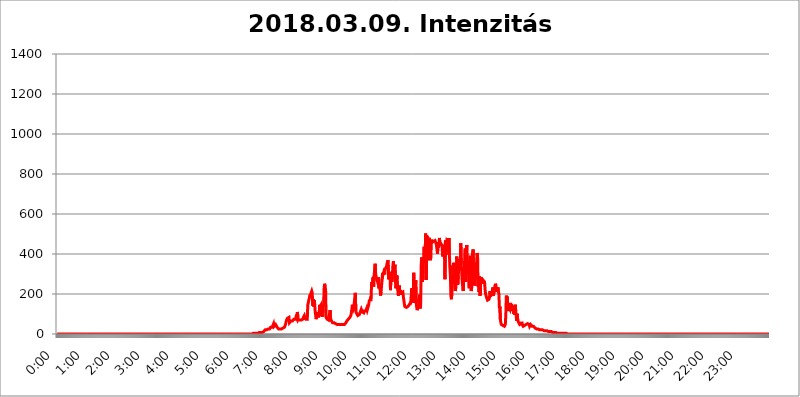
| Category | 2018.03.09. Intenzitás [W/m^2] |
|---|---|
| 0.0 | 0 |
| 0.0006944444444444445 | 0 |
| 0.001388888888888889 | 0 |
| 0.0020833333333333333 | 0 |
| 0.002777777777777778 | 0 |
| 0.003472222222222222 | 0 |
| 0.004166666666666667 | 0 |
| 0.004861111111111111 | 0 |
| 0.005555555555555556 | 0 |
| 0.0062499999999999995 | 0 |
| 0.006944444444444444 | 0 |
| 0.007638888888888889 | 0 |
| 0.008333333333333333 | 0 |
| 0.009027777777777779 | 0 |
| 0.009722222222222222 | 0 |
| 0.010416666666666666 | 0 |
| 0.011111111111111112 | 0 |
| 0.011805555555555555 | 0 |
| 0.012499999999999999 | 0 |
| 0.013194444444444444 | 0 |
| 0.013888888888888888 | 0 |
| 0.014583333333333332 | 0 |
| 0.015277777777777777 | 0 |
| 0.015972222222222224 | 0 |
| 0.016666666666666666 | 0 |
| 0.017361111111111112 | 0 |
| 0.018055555555555557 | 0 |
| 0.01875 | 0 |
| 0.019444444444444445 | 0 |
| 0.02013888888888889 | 0 |
| 0.020833333333333332 | 0 |
| 0.02152777777777778 | 0 |
| 0.022222222222222223 | 0 |
| 0.02291666666666667 | 0 |
| 0.02361111111111111 | 0 |
| 0.024305555555555556 | 0 |
| 0.024999999999999998 | 0 |
| 0.025694444444444447 | 0 |
| 0.02638888888888889 | 0 |
| 0.027083333333333334 | 0 |
| 0.027777777777777776 | 0 |
| 0.02847222222222222 | 0 |
| 0.029166666666666664 | 0 |
| 0.029861111111111113 | 0 |
| 0.030555555555555555 | 0 |
| 0.03125 | 0 |
| 0.03194444444444445 | 0 |
| 0.03263888888888889 | 0 |
| 0.03333333333333333 | 0 |
| 0.034027777777777775 | 0 |
| 0.034722222222222224 | 0 |
| 0.035416666666666666 | 0 |
| 0.036111111111111115 | 0 |
| 0.03680555555555556 | 0 |
| 0.0375 | 0 |
| 0.03819444444444444 | 0 |
| 0.03888888888888889 | 0 |
| 0.03958333333333333 | 0 |
| 0.04027777777777778 | 0 |
| 0.04097222222222222 | 0 |
| 0.041666666666666664 | 0 |
| 0.042361111111111106 | 0 |
| 0.04305555555555556 | 0 |
| 0.043750000000000004 | 0 |
| 0.044444444444444446 | 0 |
| 0.04513888888888889 | 0 |
| 0.04583333333333334 | 0 |
| 0.04652777777777778 | 0 |
| 0.04722222222222222 | 0 |
| 0.04791666666666666 | 0 |
| 0.04861111111111111 | 0 |
| 0.049305555555555554 | 0 |
| 0.049999999999999996 | 0 |
| 0.05069444444444445 | 0 |
| 0.051388888888888894 | 0 |
| 0.052083333333333336 | 0 |
| 0.05277777777777778 | 0 |
| 0.05347222222222222 | 0 |
| 0.05416666666666667 | 0 |
| 0.05486111111111111 | 0 |
| 0.05555555555555555 | 0 |
| 0.05625 | 0 |
| 0.05694444444444444 | 0 |
| 0.057638888888888885 | 0 |
| 0.05833333333333333 | 0 |
| 0.05902777777777778 | 0 |
| 0.059722222222222225 | 0 |
| 0.06041666666666667 | 0 |
| 0.061111111111111116 | 0 |
| 0.06180555555555556 | 0 |
| 0.0625 | 0 |
| 0.06319444444444444 | 0 |
| 0.06388888888888888 | 0 |
| 0.06458333333333334 | 0 |
| 0.06527777777777778 | 0 |
| 0.06597222222222222 | 0 |
| 0.06666666666666667 | 0 |
| 0.06736111111111111 | 0 |
| 0.06805555555555555 | 0 |
| 0.06874999999999999 | 0 |
| 0.06944444444444443 | 0 |
| 0.07013888888888889 | 0 |
| 0.07083333333333333 | 0 |
| 0.07152777777777779 | 0 |
| 0.07222222222222223 | 0 |
| 0.07291666666666667 | 0 |
| 0.07361111111111111 | 0 |
| 0.07430555555555556 | 0 |
| 0.075 | 0 |
| 0.07569444444444444 | 0 |
| 0.0763888888888889 | 0 |
| 0.07708333333333334 | 0 |
| 0.07777777777777778 | 0 |
| 0.07847222222222222 | 0 |
| 0.07916666666666666 | 0 |
| 0.0798611111111111 | 0 |
| 0.08055555555555556 | 0 |
| 0.08125 | 0 |
| 0.08194444444444444 | 0 |
| 0.08263888888888889 | 0 |
| 0.08333333333333333 | 0 |
| 0.08402777777777777 | 0 |
| 0.08472222222222221 | 0 |
| 0.08541666666666665 | 0 |
| 0.08611111111111112 | 0 |
| 0.08680555555555557 | 0 |
| 0.08750000000000001 | 0 |
| 0.08819444444444445 | 0 |
| 0.08888888888888889 | 0 |
| 0.08958333333333333 | 0 |
| 0.09027777777777778 | 0 |
| 0.09097222222222222 | 0 |
| 0.09166666666666667 | 0 |
| 0.09236111111111112 | 0 |
| 0.09305555555555556 | 0 |
| 0.09375 | 0 |
| 0.09444444444444444 | 0 |
| 0.09513888888888888 | 0 |
| 0.09583333333333333 | 0 |
| 0.09652777777777777 | 0 |
| 0.09722222222222222 | 0 |
| 0.09791666666666667 | 0 |
| 0.09861111111111111 | 0 |
| 0.09930555555555555 | 0 |
| 0.09999999999999999 | 0 |
| 0.10069444444444443 | 0 |
| 0.1013888888888889 | 0 |
| 0.10208333333333335 | 0 |
| 0.10277777777777779 | 0 |
| 0.10347222222222223 | 0 |
| 0.10416666666666667 | 0 |
| 0.10486111111111111 | 0 |
| 0.10555555555555556 | 0 |
| 0.10625 | 0 |
| 0.10694444444444444 | 0 |
| 0.1076388888888889 | 0 |
| 0.10833333333333334 | 0 |
| 0.10902777777777778 | 0 |
| 0.10972222222222222 | 0 |
| 0.1111111111111111 | 0 |
| 0.11180555555555556 | 0 |
| 0.11180555555555556 | 0 |
| 0.1125 | 0 |
| 0.11319444444444444 | 0 |
| 0.11388888888888889 | 0 |
| 0.11458333333333333 | 0 |
| 0.11527777777777777 | 0 |
| 0.11597222222222221 | 0 |
| 0.11666666666666665 | 0 |
| 0.1173611111111111 | 0 |
| 0.11805555555555557 | 0 |
| 0.11944444444444445 | 0 |
| 0.12013888888888889 | 0 |
| 0.12083333333333333 | 0 |
| 0.12152777777777778 | 0 |
| 0.12222222222222223 | 0 |
| 0.12291666666666667 | 0 |
| 0.12291666666666667 | 0 |
| 0.12361111111111112 | 0 |
| 0.12430555555555556 | 0 |
| 0.125 | 0 |
| 0.12569444444444444 | 0 |
| 0.12638888888888888 | 0 |
| 0.12708333333333333 | 0 |
| 0.16875 | 0 |
| 0.12847222222222224 | 0 |
| 0.12916666666666668 | 0 |
| 0.12986111111111112 | 0 |
| 0.13055555555555556 | 0 |
| 0.13125 | 0 |
| 0.13194444444444445 | 0 |
| 0.1326388888888889 | 0 |
| 0.13333333333333333 | 0 |
| 0.13402777777777777 | 0 |
| 0.13402777777777777 | 0 |
| 0.13472222222222222 | 0 |
| 0.13541666666666666 | 0 |
| 0.1361111111111111 | 0 |
| 0.13749999999999998 | 0 |
| 0.13819444444444443 | 0 |
| 0.1388888888888889 | 0 |
| 0.13958333333333334 | 0 |
| 0.14027777777777778 | 0 |
| 0.14097222222222222 | 0 |
| 0.14166666666666666 | 0 |
| 0.1423611111111111 | 0 |
| 0.14305555555555557 | 0 |
| 0.14375000000000002 | 0 |
| 0.14444444444444446 | 0 |
| 0.1451388888888889 | 0 |
| 0.1451388888888889 | 0 |
| 0.14652777777777778 | 0 |
| 0.14722222222222223 | 0 |
| 0.14791666666666667 | 0 |
| 0.1486111111111111 | 0 |
| 0.14930555555555555 | 0 |
| 0.15 | 0 |
| 0.15069444444444444 | 0 |
| 0.15138888888888888 | 0 |
| 0.15208333333333332 | 0 |
| 0.15277777777777776 | 0 |
| 0.15347222222222223 | 0 |
| 0.15416666666666667 | 0 |
| 0.15486111111111112 | 0 |
| 0.15555555555555556 | 0 |
| 0.15625 | 0 |
| 0.15694444444444444 | 0 |
| 0.15763888888888888 | 0 |
| 0.15833333333333333 | 0 |
| 0.15902777777777777 | 0 |
| 0.15972222222222224 | 0 |
| 0.16041666666666668 | 0 |
| 0.16111111111111112 | 0 |
| 0.16180555555555556 | 0 |
| 0.1625 | 0 |
| 0.16319444444444445 | 0 |
| 0.1638888888888889 | 0 |
| 0.16458333333333333 | 0 |
| 0.16527777777777777 | 0 |
| 0.16597222222222222 | 0 |
| 0.16666666666666666 | 0 |
| 0.1673611111111111 | 0 |
| 0.16805555555555554 | 0 |
| 0.16874999999999998 | 0 |
| 0.16944444444444443 | 0 |
| 0.17013888888888887 | 0 |
| 0.1708333333333333 | 0 |
| 0.17152777777777775 | 0 |
| 0.17222222222222225 | 0 |
| 0.1729166666666667 | 0 |
| 0.17361111111111113 | 0 |
| 0.17430555555555557 | 0 |
| 0.17500000000000002 | 0 |
| 0.17569444444444446 | 0 |
| 0.1763888888888889 | 0 |
| 0.17708333333333334 | 0 |
| 0.17777777777777778 | 0 |
| 0.17847222222222223 | 0 |
| 0.17916666666666667 | 0 |
| 0.1798611111111111 | 0 |
| 0.18055555555555555 | 0 |
| 0.18125 | 0 |
| 0.18194444444444444 | 0 |
| 0.1826388888888889 | 0 |
| 0.18333333333333335 | 0 |
| 0.1840277777777778 | 0 |
| 0.18472222222222223 | 0 |
| 0.18541666666666667 | 0 |
| 0.18611111111111112 | 0 |
| 0.18680555555555556 | 0 |
| 0.1875 | 0 |
| 0.18819444444444444 | 0 |
| 0.18888888888888888 | 0 |
| 0.18958333333333333 | 0 |
| 0.19027777777777777 | 0 |
| 0.1909722222222222 | 0 |
| 0.19166666666666665 | 0 |
| 0.19236111111111112 | 0 |
| 0.19305555555555554 | 0 |
| 0.19375 | 0 |
| 0.19444444444444445 | 0 |
| 0.1951388888888889 | 0 |
| 0.19583333333333333 | 0 |
| 0.19652777777777777 | 0 |
| 0.19722222222222222 | 0 |
| 0.19791666666666666 | 0 |
| 0.1986111111111111 | 0 |
| 0.19930555555555554 | 0 |
| 0.19999999999999998 | 0 |
| 0.20069444444444443 | 0 |
| 0.20138888888888887 | 0 |
| 0.2020833333333333 | 0 |
| 0.2027777777777778 | 0 |
| 0.2034722222222222 | 0 |
| 0.2041666666666667 | 0 |
| 0.20486111111111113 | 0 |
| 0.20555555555555557 | 0 |
| 0.20625000000000002 | 0 |
| 0.20694444444444446 | 0 |
| 0.2076388888888889 | 0 |
| 0.20833333333333334 | 0 |
| 0.20902777777777778 | 0 |
| 0.20972222222222223 | 0 |
| 0.21041666666666667 | 0 |
| 0.2111111111111111 | 0 |
| 0.21180555555555555 | 0 |
| 0.2125 | 0 |
| 0.21319444444444444 | 0 |
| 0.2138888888888889 | 0 |
| 0.21458333333333335 | 0 |
| 0.2152777777777778 | 0 |
| 0.21597222222222223 | 0 |
| 0.21666666666666667 | 0 |
| 0.21736111111111112 | 0 |
| 0.21805555555555556 | 0 |
| 0.21875 | 0 |
| 0.21944444444444444 | 0 |
| 0.22013888888888888 | 0 |
| 0.22083333333333333 | 0 |
| 0.22152777777777777 | 0 |
| 0.2222222222222222 | 0 |
| 0.22291666666666665 | 0 |
| 0.2236111111111111 | 0 |
| 0.22430555555555556 | 0 |
| 0.225 | 0 |
| 0.22569444444444445 | 0 |
| 0.2263888888888889 | 0 |
| 0.22708333333333333 | 0 |
| 0.22777777777777777 | 0 |
| 0.22847222222222222 | 0 |
| 0.22916666666666666 | 0 |
| 0.2298611111111111 | 0 |
| 0.23055555555555554 | 0 |
| 0.23124999999999998 | 0 |
| 0.23194444444444443 | 0 |
| 0.23263888888888887 | 0 |
| 0.2333333333333333 | 0 |
| 0.2340277777777778 | 0 |
| 0.2347222222222222 | 0 |
| 0.2354166666666667 | 0 |
| 0.23611111111111113 | 0 |
| 0.23680555555555557 | 0 |
| 0.23750000000000002 | 0 |
| 0.23819444444444446 | 0 |
| 0.2388888888888889 | 0 |
| 0.23958333333333334 | 0 |
| 0.24027777777777778 | 0 |
| 0.24097222222222223 | 0 |
| 0.24166666666666667 | 0 |
| 0.2423611111111111 | 0 |
| 0.24305555555555555 | 0 |
| 0.24375 | 0 |
| 0.24444444444444446 | 0 |
| 0.24513888888888888 | 0 |
| 0.24583333333333335 | 0 |
| 0.2465277777777778 | 0 |
| 0.24722222222222223 | 0 |
| 0.24791666666666667 | 0 |
| 0.24861111111111112 | 0 |
| 0.24930555555555556 | 0 |
| 0.25 | 0 |
| 0.25069444444444444 | 0 |
| 0.2513888888888889 | 0 |
| 0.2520833333333333 | 0 |
| 0.25277777777777777 | 0 |
| 0.2534722222222222 | 0 |
| 0.25416666666666665 | 0 |
| 0.2548611111111111 | 0 |
| 0.2555555555555556 | 0 |
| 0.25625000000000003 | 0 |
| 0.2569444444444445 | 0 |
| 0.2576388888888889 | 0 |
| 0.25833333333333336 | 0 |
| 0.2590277777777778 | 0 |
| 0.25972222222222224 | 0 |
| 0.2604166666666667 | 0 |
| 0.2611111111111111 | 0 |
| 0.26180555555555557 | 0 |
| 0.2625 | 0 |
| 0.26319444444444445 | 0 |
| 0.2638888888888889 | 0 |
| 0.26458333333333334 | 0 |
| 0.2652777777777778 | 0 |
| 0.2659722222222222 | 0 |
| 0.26666666666666666 | 0 |
| 0.2673611111111111 | 0 |
| 0.26805555555555555 | 0 |
| 0.26875 | 0 |
| 0.26944444444444443 | 0 |
| 0.2701388888888889 | 0 |
| 0.2708333333333333 | 0 |
| 0.27152777777777776 | 0 |
| 0.2722222222222222 | 0 |
| 0.27291666666666664 | 0 |
| 0.2736111111111111 | 0 |
| 0.2743055555555555 | 3.525 |
| 0.27499999999999997 | 3.525 |
| 0.27569444444444446 | 3.525 |
| 0.27638888888888885 | 3.525 |
| 0.27708333333333335 | 3.525 |
| 0.2777777777777778 | 3.525 |
| 0.27847222222222223 | 3.525 |
| 0.2791666666666667 | 3.525 |
| 0.2798611111111111 | 3.525 |
| 0.28055555555555556 | 3.525 |
| 0.28125 | 3.525 |
| 0.28194444444444444 | 3.525 |
| 0.2826388888888889 | 3.525 |
| 0.2833333333333333 | 7.887 |
| 0.28402777777777777 | 7.887 |
| 0.2847222222222222 | 7.887 |
| 0.28541666666666665 | 7.887 |
| 0.28611111111111115 | 7.887 |
| 0.28680555555555554 | 12.257 |
| 0.28750000000000003 | 7.887 |
| 0.2881944444444445 | 12.257 |
| 0.2888888888888889 | 12.257 |
| 0.28958333333333336 | 12.257 |
| 0.2902777777777778 | 16.636 |
| 0.29097222222222224 | 16.636 |
| 0.2916666666666667 | 21.024 |
| 0.2923611111111111 | 21.024 |
| 0.29305555555555557 | 21.024 |
| 0.29375 | 21.024 |
| 0.29444444444444445 | 25.419 |
| 0.2951388888888889 | 25.419 |
| 0.29583333333333334 | 25.419 |
| 0.2965277777777778 | 21.024 |
| 0.2972222222222222 | 25.419 |
| 0.29791666666666666 | 25.419 |
| 0.2986111111111111 | 29.823 |
| 0.29930555555555555 | 34.234 |
| 0.3 | 38.653 |
| 0.30069444444444443 | 38.653 |
| 0.3013888888888889 | 34.234 |
| 0.3020833333333333 | 29.823 |
| 0.30277777777777776 | 38.653 |
| 0.3034722222222222 | 51.951 |
| 0.30416666666666664 | 38.653 |
| 0.3048611111111111 | 43.079 |
| 0.3055555555555555 | 43.079 |
| 0.30624999999999997 | 47.511 |
| 0.3069444444444444 | 51.951 |
| 0.3076388888888889 | 43.079 |
| 0.30833333333333335 | 34.234 |
| 0.3090277777777778 | 29.823 |
| 0.30972222222222223 | 29.823 |
| 0.3104166666666667 | 25.419 |
| 0.3111111111111111 | 25.419 |
| 0.31180555555555556 | 25.419 |
| 0.3125 | 25.419 |
| 0.31319444444444444 | 25.419 |
| 0.3138888888888889 | 25.419 |
| 0.3145833333333333 | 25.419 |
| 0.31527777777777777 | 25.419 |
| 0.3159722222222222 | 25.419 |
| 0.31666666666666665 | 29.823 |
| 0.31736111111111115 | 29.823 |
| 0.31805555555555554 | 34.234 |
| 0.31875000000000003 | 34.234 |
| 0.3194444444444445 | 38.653 |
| 0.3201388888888889 | 47.511 |
| 0.32083333333333336 | 51.951 |
| 0.3215277777777778 | 69.775 |
| 0.32222222222222224 | 65.31 |
| 0.3229166666666667 | 78.722 |
| 0.3236111111111111 | 83.205 |
| 0.32430555555555557 | 74.246 |
| 0.325 | 83.205 |
| 0.32569444444444445 | 56.398 |
| 0.3263888888888889 | 51.951 |
| 0.32708333333333334 | 56.398 |
| 0.3277777777777778 | 65.31 |
| 0.3284722222222222 | 65.31 |
| 0.32916666666666666 | 60.85 |
| 0.3298611111111111 | 65.31 |
| 0.33055555555555555 | 60.85 |
| 0.33125 | 65.31 |
| 0.33194444444444443 | 74.246 |
| 0.3326388888888889 | 69.775 |
| 0.3333333333333333 | 69.775 |
| 0.3340277777777778 | 74.246 |
| 0.3347222222222222 | 83.205 |
| 0.3354166666666667 | 78.722 |
| 0.3361111111111111 | 74.246 |
| 0.3368055555555556 | 110.201 |
| 0.33749999999999997 | 83.205 |
| 0.33819444444444446 | 69.775 |
| 0.33888888888888885 | 69.775 |
| 0.33958333333333335 | 65.31 |
| 0.34027777777777773 | 69.775 |
| 0.34097222222222223 | 69.775 |
| 0.3416666666666666 | 74.246 |
| 0.3423611111111111 | 69.775 |
| 0.3430555555555555 | 74.246 |
| 0.34375 | 74.246 |
| 0.3444444444444445 | 74.246 |
| 0.3451388888888889 | 83.205 |
| 0.3458333333333334 | 83.205 |
| 0.34652777777777777 | 92.184 |
| 0.34722222222222227 | 83.205 |
| 0.34791666666666665 | 83.205 |
| 0.34861111111111115 | 74.246 |
| 0.34930555555555554 | 74.246 |
| 0.35000000000000003 | 78.722 |
| 0.3506944444444444 | 74.246 |
| 0.3513888888888889 | 146.423 |
| 0.3520833333333333 | 155.509 |
| 0.3527777777777778 | 169.156 |
| 0.3534722222222222 | 178.264 |
| 0.3541666666666667 | 191.937 |
| 0.3548611111111111 | 196.497 |
| 0.35555555555555557 | 201.058 |
| 0.35625 | 201.058 |
| 0.35694444444444445 | 214.746 |
| 0.3576388888888889 | 205.62 |
| 0.35833333333333334 | 141.884 |
| 0.3590277777777778 | 173.709 |
| 0.3597222222222222 | 137.347 |
| 0.36041666666666666 | 169.156 |
| 0.3611111111111111 | 146.423 |
| 0.36180555555555555 | 110.201 |
| 0.3625 | 92.184 |
| 0.36319444444444443 | 74.246 |
| 0.3638888888888889 | 78.722 |
| 0.3645833333333333 | 110.201 |
| 0.3652777777777778 | 110.201 |
| 0.3659722222222222 | 83.205 |
| 0.3666666666666667 | 92.184 |
| 0.3673611111111111 | 101.184 |
| 0.3680555555555556 | 146.423 |
| 0.36874999999999997 | 137.347 |
| 0.36944444444444446 | 137.347 |
| 0.37013888888888885 | 146.423 |
| 0.37083333333333335 | 87.692 |
| 0.37152777777777773 | 119.235 |
| 0.37222222222222223 | 87.692 |
| 0.3729166666666666 | 128.284 |
| 0.3736111111111111 | 146.423 |
| 0.3743055555555555 | 228.436 |
| 0.375 | 251.251 |
| 0.3756944444444445 | 237.564 |
| 0.3763888888888889 | 219.309 |
| 0.3770833333333334 | 83.205 |
| 0.37777777777777777 | 78.722 |
| 0.37847222222222227 | 74.246 |
| 0.37916666666666665 | 78.722 |
| 0.37986111111111115 | 78.722 |
| 0.38055555555555554 | 69.775 |
| 0.38125000000000003 | 65.31 |
| 0.3819444444444444 | 65.31 |
| 0.3826388888888889 | 119.235 |
| 0.3833333333333333 | 78.722 |
| 0.3840277777777778 | 69.775 |
| 0.3847222222222222 | 65.31 |
| 0.3854166666666667 | 65.31 |
| 0.3861111111111111 | 56.398 |
| 0.38680555555555557 | 56.398 |
| 0.3875 | 56.398 |
| 0.38819444444444445 | 56.398 |
| 0.3888888888888889 | 51.951 |
| 0.38958333333333334 | 51.951 |
| 0.3902777777777778 | 51.951 |
| 0.3909722222222222 | 51.951 |
| 0.39166666666666666 | 47.511 |
| 0.3923611111111111 | 47.511 |
| 0.39305555555555555 | 47.511 |
| 0.39375 | 47.511 |
| 0.39444444444444443 | 47.511 |
| 0.3951388888888889 | 47.511 |
| 0.3958333333333333 | 47.511 |
| 0.3965277777777778 | 47.511 |
| 0.3972222222222222 | 47.511 |
| 0.3979166666666667 | 47.511 |
| 0.3986111111111111 | 47.511 |
| 0.3993055555555556 | 47.511 |
| 0.39999999999999997 | 47.511 |
| 0.40069444444444446 | 47.511 |
| 0.40138888888888885 | 47.511 |
| 0.40208333333333335 | 47.511 |
| 0.40277777777777773 | 47.511 |
| 0.40347222222222223 | 47.511 |
| 0.4041666666666666 | 51.951 |
| 0.4048611111111111 | 56.398 |
| 0.4055555555555555 | 60.85 |
| 0.40625 | 65.31 |
| 0.4069444444444445 | 69.775 |
| 0.4076388888888889 | 69.775 |
| 0.4083333333333334 | 74.246 |
| 0.40902777777777777 | 74.246 |
| 0.40972222222222227 | 78.722 |
| 0.41041666666666665 | 83.205 |
| 0.41111111111111115 | 87.692 |
| 0.41180555555555554 | 92.184 |
| 0.41250000000000003 | 105.69 |
| 0.4131944444444444 | 123.758 |
| 0.4138888888888889 | 146.423 |
| 0.4145833333333333 | 137.347 |
| 0.4152777777777778 | 128.284 |
| 0.4159722222222222 | 137.347 |
| 0.4166666666666667 | 137.347 |
| 0.4173611111111111 | 132.814 |
| 0.41805555555555557 | 205.62 |
| 0.41875 | 114.716 |
| 0.41944444444444445 | 105.69 |
| 0.4201388888888889 | 105.69 |
| 0.42083333333333334 | 101.184 |
| 0.4215277777777778 | 92.184 |
| 0.4222222222222222 | 92.184 |
| 0.42291666666666666 | 92.184 |
| 0.4236111111111111 | 96.682 |
| 0.42430555555555555 | 101.184 |
| 0.425 | 110.201 |
| 0.42569444444444443 | 114.716 |
| 0.4263888888888889 | 123.758 |
| 0.4270833333333333 | 119.235 |
| 0.4277777777777778 | 110.201 |
| 0.4284722222222222 | 105.69 |
| 0.4291666666666667 | 105.69 |
| 0.4298611111111111 | 105.69 |
| 0.4305555555555556 | 114.716 |
| 0.43124999999999997 | 119.235 |
| 0.43194444444444446 | 119.235 |
| 0.43263888888888885 | 114.716 |
| 0.43333333333333335 | 119.235 |
| 0.43402777777777773 | 128.284 |
| 0.43472222222222223 | 119.235 |
| 0.4354166666666666 | 128.284 |
| 0.4361111111111111 | 137.347 |
| 0.4368055555555555 | 146.423 |
| 0.4375 | 164.605 |
| 0.4381944444444445 | 169.156 |
| 0.4388888888888889 | 173.709 |
| 0.4395833333333334 | 164.605 |
| 0.44027777777777777 | 191.937 |
| 0.44097222222222227 | 260.373 |
| 0.44166666666666665 | 242.127 |
| 0.44236111111111115 | 242.127 |
| 0.44305555555555554 | 283.156 |
| 0.44375000000000003 | 237.564 |
| 0.4444444444444444 | 292.259 |
| 0.4451388888888889 | 287.709 |
| 0.4458333333333333 | 351.198 |
| 0.4465277777777778 | 301.354 |
| 0.4472222222222222 | 287.709 |
| 0.4479166666666667 | 287.709 |
| 0.4486111111111111 | 269.49 |
| 0.44930555555555557 | 260.373 |
| 0.45 | 269.49 |
| 0.45069444444444445 | 283.156 |
| 0.4513888888888889 | 228.436 |
| 0.45208333333333334 | 251.251 |
| 0.4527777777777778 | 223.873 |
| 0.4534722222222222 | 191.937 |
| 0.45416666666666666 | 210.182 |
| 0.4548611111111111 | 214.746 |
| 0.45555555555555555 | 269.49 |
| 0.45625 | 305.898 |
| 0.45694444444444443 | 296.808 |
| 0.4576388888888889 | 305.898 |
| 0.4583333333333333 | 296.808 |
| 0.4590277777777778 | 314.98 |
| 0.4597222222222222 | 319.517 |
| 0.4604166666666667 | 328.584 |
| 0.4611111111111111 | 324.052 |
| 0.4618055555555556 | 337.639 |
| 0.46249999999999997 | 351.198 |
| 0.46319444444444446 | 360.221 |
| 0.46388888888888885 | 369.23 |
| 0.46458333333333335 | 274.047 |
| 0.46527777777777773 | 310.44 |
| 0.46597222222222223 | 310.44 |
| 0.4666666666666666 | 292.259 |
| 0.4673611111111111 | 219.309 |
| 0.4680555555555555 | 292.259 |
| 0.46875 | 283.156 |
| 0.4694444444444445 | 260.373 |
| 0.4701388888888889 | 301.354 |
| 0.4708333333333334 | 346.682 |
| 0.47152777777777777 | 364.728 |
| 0.47222222222222227 | 296.808 |
| 0.47291666666666665 | 324.052 |
| 0.47361111111111115 | 346.682 |
| 0.47430555555555554 | 269.49 |
| 0.47500000000000003 | 228.436 |
| 0.4756944444444444 | 228.436 |
| 0.4763888888888889 | 292.259 |
| 0.4770833333333333 | 223.873 |
| 0.4777777777777778 | 233 |
| 0.4784722222222222 | 191.937 |
| 0.4791666666666667 | 214.746 |
| 0.4798611111111111 | 242.127 |
| 0.48055555555555557 | 201.058 |
| 0.48125 | 219.309 |
| 0.48194444444444445 | 196.497 |
| 0.4826388888888889 | 205.62 |
| 0.48333333333333334 | 205.62 |
| 0.4840277777777778 | 210.182 |
| 0.4847222222222222 | 210.182 |
| 0.48541666666666666 | 187.378 |
| 0.4861111111111111 | 169.156 |
| 0.48680555555555555 | 150.964 |
| 0.4875 | 137.347 |
| 0.48819444444444443 | 132.814 |
| 0.4888888888888889 | 132.814 |
| 0.4895833333333333 | 132.814 |
| 0.4902777777777778 | 132.814 |
| 0.4909722222222222 | 137.347 |
| 0.4916666666666667 | 137.347 |
| 0.4923611111111111 | 137.347 |
| 0.4930555555555556 | 141.884 |
| 0.49374999999999997 | 146.423 |
| 0.49444444444444446 | 146.423 |
| 0.49513888888888885 | 150.964 |
| 0.49583333333333335 | 160.056 |
| 0.49652777777777773 | 160.056 |
| 0.49722222222222223 | 228.436 |
| 0.4979166666666666 | 169.156 |
| 0.4986111111111111 | 164.605 |
| 0.4993055555555555 | 178.264 |
| 0.5 | 305.898 |
| 0.5006944444444444 | 155.509 |
| 0.5013888888888889 | 155.509 |
| 0.5020833333333333 | 187.378 |
| 0.5027777777777778 | 269.49 |
| 0.5034722222222222 | 155.509 |
| 0.5041666666666667 | 132.814 |
| 0.5048611111111111 | 119.235 |
| 0.5055555555555555 | 123.758 |
| 0.50625 | 141.884 |
| 0.5069444444444444 | 128.284 |
| 0.5076388888888889 | 128.284 |
| 0.5083333333333333 | 196.497 |
| 0.5090277777777777 | 128.284 |
| 0.5097222222222222 | 146.423 |
| 0.5104166666666666 | 342.162 |
| 0.5111111111111112 | 382.715 |
| 0.5118055555555555 | 260.373 |
| 0.5125000000000001 | 301.354 |
| 0.5131944444444444 | 351.198 |
| 0.513888888888889 | 373.729 |
| 0.5145833333333333 | 436.27 |
| 0.5152777777777778 | 355.712 |
| 0.5159722222222222 | 400.638 |
| 0.5166666666666667 | 502.192 |
| 0.517361111111111 | 269.49 |
| 0.5180555555555556 | 493.475 |
| 0.5187499999999999 | 431.833 |
| 0.5194444444444445 | 489.108 |
| 0.5201388888888888 | 369.23 |
| 0.5208333333333334 | 445.129 |
| 0.5215277777777778 | 480.356 |
| 0.5222222222222223 | 480.356 |
| 0.5229166666666667 | 462.786 |
| 0.5236111111111111 | 369.23 |
| 0.5243055555555556 | 453.968 |
| 0.525 | 471.582 |
| 0.5256944444444445 | 458.38 |
| 0.5263888888888889 | 458.38 |
| 0.5270833333333333 | 453.968 |
| 0.5277777777777778 | 462.786 |
| 0.5284722222222222 | 462.786 |
| 0.5291666666666667 | 467.187 |
| 0.5298611111111111 | 467.187 |
| 0.5305555555555556 | 467.187 |
| 0.53125 | 453.968 |
| 0.5319444444444444 | 440.702 |
| 0.5326388888888889 | 440.702 |
| 0.5333333333333333 | 400.638 |
| 0.5340277777777778 | 458.38 |
| 0.5347222222222222 | 431.833 |
| 0.5354166666666667 | 449.551 |
| 0.5361111111111111 | 480.356 |
| 0.5368055555555555 | 440.702 |
| 0.5375 | 453.968 |
| 0.5381944444444444 | 458.38 |
| 0.5388888888888889 | 449.551 |
| 0.5395833333333333 | 445.129 |
| 0.5402777777777777 | 405.108 |
| 0.5409722222222222 | 387.202 |
| 0.5416666666666666 | 431.833 |
| 0.5423611111111112 | 445.129 |
| 0.5430555555555555 | 427.39 |
| 0.5437500000000001 | 274.047 |
| 0.5444444444444444 | 467.187 |
| 0.545138888888889 | 396.164 |
| 0.5458333333333333 | 422.943 |
| 0.5465277777777778 | 462.786 |
| 0.5472222222222222 | 467.187 |
| 0.5479166666666667 | 453.968 |
| 0.548611111111111 | 414.035 |
| 0.5493055555555556 | 480.356 |
| 0.5499999999999999 | 396.164 |
| 0.5506944444444445 | 333.113 |
| 0.5513888888888888 | 292.259 |
| 0.5520833333333334 | 191.937 |
| 0.5527777777777778 | 173.709 |
| 0.5534722222222223 | 205.62 |
| 0.5541666666666667 | 246.689 |
| 0.5548611111111111 | 342.162 |
| 0.5555555555555556 | 274.047 |
| 0.55625 | 355.712 |
| 0.5569444444444445 | 283.156 |
| 0.5576388888888889 | 351.198 |
| 0.5583333333333333 | 214.746 |
| 0.5590277777777778 | 237.564 |
| 0.5597222222222222 | 255.813 |
| 0.5604166666666667 | 387.202 |
| 0.5611111111111111 | 269.49 |
| 0.5618055555555556 | 246.689 |
| 0.5625 | 292.259 |
| 0.5631944444444444 | 355.712 |
| 0.5638888888888889 | 373.729 |
| 0.5645833333333333 | 342.162 |
| 0.5652777777777778 | 360.221 |
| 0.5659722222222222 | 453.968 |
| 0.5666666666666667 | 346.682 |
| 0.5673611111111111 | 301.354 |
| 0.5680555555555555 | 255.813 |
| 0.56875 | 251.251 |
| 0.5694444444444444 | 214.746 |
| 0.5701388888888889 | 283.156 |
| 0.5708333333333333 | 296.808 |
| 0.5715277777777777 | 387.202 |
| 0.5722222222222222 | 427.39 |
| 0.5729166666666666 | 260.373 |
| 0.5736111111111112 | 264.932 |
| 0.5743055555555555 | 445.129 |
| 0.5750000000000001 | 305.898 |
| 0.5756944444444444 | 314.98 |
| 0.576388888888889 | 364.728 |
| 0.5770833333333333 | 296.808 |
| 0.5777777777777778 | 228.436 |
| 0.5784722222222222 | 355.712 |
| 0.5791666666666667 | 391.685 |
| 0.579861111111111 | 246.689 |
| 0.5805555555555556 | 214.746 |
| 0.5812499999999999 | 233 |
| 0.5819444444444445 | 364.728 |
| 0.5826388888888888 | 409.574 |
| 0.5833333333333334 | 422.943 |
| 0.5840277777777778 | 269.49 |
| 0.5847222222222223 | 342.162 |
| 0.5854166666666667 | 242.127 |
| 0.5861111111111111 | 264.932 |
| 0.5868055555555556 | 278.603 |
| 0.5875 | 278.603 |
| 0.5881944444444445 | 360.221 |
| 0.5888888888888889 | 405.108 |
| 0.5895833333333333 | 382.715 |
| 0.5902777777777778 | 237.564 |
| 0.5909722222222222 | 278.603 |
| 0.5916666666666667 | 210.182 |
| 0.5923611111111111 | 287.709 |
| 0.5930555555555556 | 191.937 |
| 0.59375 | 269.49 |
| 0.5944444444444444 | 283.156 |
| 0.5951388888888889 | 278.603 |
| 0.5958333333333333 | 278.603 |
| 0.5965277777777778 | 251.251 |
| 0.5972222222222222 | 269.49 |
| 0.5979166666666667 | 269.49 |
| 0.5986111111111111 | 269.49 |
| 0.5993055555555555 | 260.373 |
| 0.6 | 223.873 |
| 0.6006944444444444 | 201.058 |
| 0.6013888888888889 | 201.058 |
| 0.6020833333333333 | 182.82 |
| 0.6027777777777777 | 178.264 |
| 0.6034722222222222 | 169.156 |
| 0.6041666666666666 | 164.605 |
| 0.6048611111111112 | 169.156 |
| 0.6055555555555555 | 173.709 |
| 0.6062500000000001 | 182.82 |
| 0.6069444444444444 | 214.746 |
| 0.607638888888889 | 187.378 |
| 0.6083333333333333 | 182.82 |
| 0.6090277777777778 | 201.058 |
| 0.6097222222222222 | 196.497 |
| 0.6104166666666667 | 219.309 |
| 0.611111111111111 | 233 |
| 0.6118055555555556 | 191.937 |
| 0.6124999999999999 | 210.182 |
| 0.6131944444444445 | 228.436 |
| 0.6138888888888888 | 228.436 |
| 0.6145833333333334 | 251.251 |
| 0.6152777777777778 | 242.127 |
| 0.6159722222222223 | 219.309 |
| 0.6166666666666667 | 210.182 |
| 0.6173611111111111 | 214.746 |
| 0.6180555555555556 | 233 |
| 0.61875 | 210.182 |
| 0.6194444444444445 | 201.058 |
| 0.6201388888888889 | 128.284 |
| 0.6208333333333333 | 137.347 |
| 0.6215277777777778 | 69.775 |
| 0.6222222222222222 | 56.398 |
| 0.6229166666666667 | 47.511 |
| 0.6236111111111111 | 47.511 |
| 0.6243055555555556 | 43.079 |
| 0.625 | 43.079 |
| 0.6256944444444444 | 38.653 |
| 0.6263888888888889 | 38.653 |
| 0.6270833333333333 | 38.653 |
| 0.6277777777777778 | 43.079 |
| 0.6284722222222222 | 47.511 |
| 0.6291666666666667 | 101.184 |
| 0.6298611111111111 | 191.937 |
| 0.6305555555555555 | 178.264 |
| 0.63125 | 187.378 |
| 0.6319444444444444 | 114.716 |
| 0.6326388888888889 | 137.347 |
| 0.6333333333333333 | 141.884 |
| 0.6340277777777777 | 141.884 |
| 0.6347222222222222 | 123.758 |
| 0.6354166666666666 | 155.509 |
| 0.6361111111111112 | 132.814 |
| 0.6368055555555555 | 150.964 |
| 0.6375000000000001 | 119.235 |
| 0.6381944444444444 | 141.884 |
| 0.638888888888889 | 114.716 |
| 0.6395833333333333 | 123.758 |
| 0.6402777777777778 | 101.184 |
| 0.6409722222222222 | 110.201 |
| 0.6416666666666667 | 96.682 |
| 0.642361111111111 | 146.423 |
| 0.6430555555555556 | 114.716 |
| 0.6437499999999999 | 87.692 |
| 0.6444444444444445 | 65.31 |
| 0.6451388888888888 | 101.184 |
| 0.6458333333333334 | 69.775 |
| 0.6465277777777778 | 74.246 |
| 0.6472222222222223 | 56.398 |
| 0.6479166666666667 | 51.951 |
| 0.6486111111111111 | 47.511 |
| 0.6493055555555556 | 47.511 |
| 0.65 | 47.511 |
| 0.6506944444444445 | 51.951 |
| 0.6513888888888889 | 60.85 |
| 0.6520833333333333 | 47.511 |
| 0.6527777777777778 | 43.079 |
| 0.6534722222222222 | 38.653 |
| 0.6541666666666667 | 38.653 |
| 0.6548611111111111 | 38.653 |
| 0.6555555555555556 | 43.079 |
| 0.65625 | 47.511 |
| 0.6569444444444444 | 47.511 |
| 0.6576388888888889 | 47.511 |
| 0.6583333333333333 | 51.951 |
| 0.6590277777777778 | 47.511 |
| 0.6597222222222222 | 51.951 |
| 0.6604166666666667 | 47.511 |
| 0.6611111111111111 | 51.951 |
| 0.6618055555555555 | 47.511 |
| 0.6625 | 38.653 |
| 0.6631944444444444 | 38.653 |
| 0.6638888888888889 | 47.511 |
| 0.6645833333333333 | 43.079 |
| 0.6652777777777777 | 43.079 |
| 0.6659722222222222 | 38.653 |
| 0.6666666666666666 | 43.079 |
| 0.6673611111111111 | 34.234 |
| 0.6680555555555556 | 38.653 |
| 0.6687500000000001 | 34.234 |
| 0.6694444444444444 | 34.234 |
| 0.6701388888888888 | 29.823 |
| 0.6708333333333334 | 29.823 |
| 0.6715277777777778 | 29.823 |
| 0.6722222222222222 | 25.419 |
| 0.6729166666666666 | 25.419 |
| 0.6736111111111112 | 25.419 |
| 0.6743055555555556 | 25.419 |
| 0.6749999999999999 | 25.419 |
| 0.6756944444444444 | 21.024 |
| 0.6763888888888889 | 21.024 |
| 0.6770833333333334 | 21.024 |
| 0.6777777777777777 | 21.024 |
| 0.6784722222222223 | 21.024 |
| 0.6791666666666667 | 21.024 |
| 0.6798611111111111 | 21.024 |
| 0.6805555555555555 | 21.024 |
| 0.68125 | 21.024 |
| 0.6819444444444445 | 21.024 |
| 0.6826388888888889 | 16.636 |
| 0.6833333333333332 | 16.636 |
| 0.6840277777777778 | 16.636 |
| 0.6847222222222222 | 16.636 |
| 0.6854166666666667 | 16.636 |
| 0.686111111111111 | 16.636 |
| 0.6868055555555556 | 16.636 |
| 0.6875 | 16.636 |
| 0.6881944444444444 | 12.257 |
| 0.688888888888889 | 12.257 |
| 0.6895833333333333 | 12.257 |
| 0.6902777777777778 | 12.257 |
| 0.6909722222222222 | 12.257 |
| 0.6916666666666668 | 12.257 |
| 0.6923611111111111 | 12.257 |
| 0.6930555555555555 | 12.257 |
| 0.69375 | 12.257 |
| 0.6944444444444445 | 12.257 |
| 0.6951388888888889 | 7.887 |
| 0.6958333333333333 | 7.887 |
| 0.6965277777777777 | 7.887 |
| 0.6972222222222223 | 7.887 |
| 0.6979166666666666 | 7.887 |
| 0.6986111111111111 | 3.525 |
| 0.6993055555555556 | 7.887 |
| 0.7000000000000001 | 7.887 |
| 0.7006944444444444 | 3.525 |
| 0.7013888888888888 | 3.525 |
| 0.7020833333333334 | 3.525 |
| 0.7027777777777778 | 7.887 |
| 0.7034722222222222 | 3.525 |
| 0.7041666666666666 | 3.525 |
| 0.7048611111111112 | 3.525 |
| 0.7055555555555556 | 3.525 |
| 0.7062499999999999 | 3.525 |
| 0.7069444444444444 | 3.525 |
| 0.7076388888888889 | 3.525 |
| 0.7083333333333334 | 3.525 |
| 0.7090277777777777 | 3.525 |
| 0.7097222222222223 | 3.525 |
| 0.7104166666666667 | 3.525 |
| 0.7111111111111111 | 3.525 |
| 0.7118055555555555 | 3.525 |
| 0.7125 | 3.525 |
| 0.7131944444444445 | 3.525 |
| 0.7138888888888889 | 3.525 |
| 0.7145833333333332 | 3.525 |
| 0.7152777777777778 | 3.525 |
| 0.7159722222222222 | 0 |
| 0.7166666666666667 | 0 |
| 0.717361111111111 | 0 |
| 0.7180555555555556 | 0 |
| 0.71875 | 0 |
| 0.7194444444444444 | 0 |
| 0.720138888888889 | 0 |
| 0.7208333333333333 | 0 |
| 0.7215277777777778 | 0 |
| 0.7222222222222222 | 0 |
| 0.7229166666666668 | 0 |
| 0.7236111111111111 | 0 |
| 0.7243055555555555 | 0 |
| 0.725 | 0 |
| 0.7256944444444445 | 0 |
| 0.7263888888888889 | 0 |
| 0.7270833333333333 | 0 |
| 0.7277777777777777 | 0 |
| 0.7284722222222223 | 0 |
| 0.7291666666666666 | 0 |
| 0.7298611111111111 | 0 |
| 0.7305555555555556 | 0 |
| 0.7312500000000001 | 0 |
| 0.7319444444444444 | 0 |
| 0.7326388888888888 | 0 |
| 0.7333333333333334 | 0 |
| 0.7340277777777778 | 0 |
| 0.7347222222222222 | 0 |
| 0.7354166666666666 | 0 |
| 0.7361111111111112 | 0 |
| 0.7368055555555556 | 0 |
| 0.7374999999999999 | 0 |
| 0.7381944444444444 | 0 |
| 0.7388888888888889 | 0 |
| 0.7395833333333334 | 0 |
| 0.7402777777777777 | 0 |
| 0.7409722222222223 | 0 |
| 0.7416666666666667 | 0 |
| 0.7423611111111111 | 0 |
| 0.7430555555555555 | 0 |
| 0.74375 | 0 |
| 0.7444444444444445 | 0 |
| 0.7451388888888889 | 0 |
| 0.7458333333333332 | 0 |
| 0.7465277777777778 | 0 |
| 0.7472222222222222 | 0 |
| 0.7479166666666667 | 0 |
| 0.748611111111111 | 0 |
| 0.7493055555555556 | 0 |
| 0.75 | 0 |
| 0.7506944444444444 | 0 |
| 0.751388888888889 | 0 |
| 0.7520833333333333 | 0 |
| 0.7527777777777778 | 0 |
| 0.7534722222222222 | 0 |
| 0.7541666666666668 | 0 |
| 0.7548611111111111 | 0 |
| 0.7555555555555555 | 0 |
| 0.75625 | 0 |
| 0.7569444444444445 | 0 |
| 0.7576388888888889 | 0 |
| 0.7583333333333333 | 0 |
| 0.7590277777777777 | 0 |
| 0.7597222222222223 | 0 |
| 0.7604166666666666 | 0 |
| 0.7611111111111111 | 0 |
| 0.7618055555555556 | 0 |
| 0.7625000000000001 | 0 |
| 0.7631944444444444 | 0 |
| 0.7638888888888888 | 0 |
| 0.7645833333333334 | 0 |
| 0.7652777777777778 | 0 |
| 0.7659722222222222 | 0 |
| 0.7666666666666666 | 0 |
| 0.7673611111111112 | 0 |
| 0.7680555555555556 | 0 |
| 0.7687499999999999 | 0 |
| 0.7694444444444444 | 0 |
| 0.7701388888888889 | 0 |
| 0.7708333333333334 | 0 |
| 0.7715277777777777 | 0 |
| 0.7722222222222223 | 0 |
| 0.7729166666666667 | 0 |
| 0.7736111111111111 | 0 |
| 0.7743055555555555 | 0 |
| 0.775 | 0 |
| 0.7756944444444445 | 0 |
| 0.7763888888888889 | 0 |
| 0.7770833333333332 | 0 |
| 0.7777777777777778 | 0 |
| 0.7784722222222222 | 0 |
| 0.7791666666666667 | 0 |
| 0.779861111111111 | 0 |
| 0.7805555555555556 | 0 |
| 0.78125 | 0 |
| 0.7819444444444444 | 0 |
| 0.782638888888889 | 0 |
| 0.7833333333333333 | 0 |
| 0.7840277777777778 | 0 |
| 0.7847222222222222 | 0 |
| 0.7854166666666668 | 0 |
| 0.7861111111111111 | 0 |
| 0.7868055555555555 | 0 |
| 0.7875 | 0 |
| 0.7881944444444445 | 0 |
| 0.7888888888888889 | 0 |
| 0.7895833333333333 | 0 |
| 0.7902777777777777 | 0 |
| 0.7909722222222223 | 0 |
| 0.7916666666666666 | 0 |
| 0.7923611111111111 | 0 |
| 0.7930555555555556 | 0 |
| 0.7937500000000001 | 0 |
| 0.7944444444444444 | 0 |
| 0.7951388888888888 | 0 |
| 0.7958333333333334 | 0 |
| 0.7965277777777778 | 0 |
| 0.7972222222222222 | 0 |
| 0.7979166666666666 | 0 |
| 0.7986111111111112 | 0 |
| 0.7993055555555556 | 0 |
| 0.7999999999999999 | 0 |
| 0.8006944444444444 | 0 |
| 0.8013888888888889 | 0 |
| 0.8020833333333334 | 0 |
| 0.8027777777777777 | 0 |
| 0.8034722222222223 | 0 |
| 0.8041666666666667 | 0 |
| 0.8048611111111111 | 0 |
| 0.8055555555555555 | 0 |
| 0.80625 | 0 |
| 0.8069444444444445 | 0 |
| 0.8076388888888889 | 0 |
| 0.8083333333333332 | 0 |
| 0.8090277777777778 | 0 |
| 0.8097222222222222 | 0 |
| 0.8104166666666667 | 0 |
| 0.811111111111111 | 0 |
| 0.8118055555555556 | 0 |
| 0.8125 | 0 |
| 0.8131944444444444 | 0 |
| 0.813888888888889 | 0 |
| 0.8145833333333333 | 0 |
| 0.8152777777777778 | 0 |
| 0.8159722222222222 | 0 |
| 0.8166666666666668 | 0 |
| 0.8173611111111111 | 0 |
| 0.8180555555555555 | 0 |
| 0.81875 | 0 |
| 0.8194444444444445 | 0 |
| 0.8201388888888889 | 0 |
| 0.8208333333333333 | 0 |
| 0.8215277777777777 | 0 |
| 0.8222222222222223 | 0 |
| 0.8229166666666666 | 0 |
| 0.8236111111111111 | 0 |
| 0.8243055555555556 | 0 |
| 0.8250000000000001 | 0 |
| 0.8256944444444444 | 0 |
| 0.8263888888888888 | 0 |
| 0.8270833333333334 | 0 |
| 0.8277777777777778 | 0 |
| 0.8284722222222222 | 0 |
| 0.8291666666666666 | 0 |
| 0.8298611111111112 | 0 |
| 0.8305555555555556 | 0 |
| 0.8312499999999999 | 0 |
| 0.8319444444444444 | 0 |
| 0.8326388888888889 | 0 |
| 0.8333333333333334 | 0 |
| 0.8340277777777777 | 0 |
| 0.8347222222222223 | 0 |
| 0.8354166666666667 | 0 |
| 0.8361111111111111 | 0 |
| 0.8368055555555555 | 0 |
| 0.8375 | 0 |
| 0.8381944444444445 | 0 |
| 0.8388888888888889 | 0 |
| 0.8395833333333332 | 0 |
| 0.8402777777777778 | 0 |
| 0.8409722222222222 | 0 |
| 0.8416666666666667 | 0 |
| 0.842361111111111 | 0 |
| 0.8430555555555556 | 0 |
| 0.84375 | 0 |
| 0.8444444444444444 | 0 |
| 0.845138888888889 | 0 |
| 0.8458333333333333 | 0 |
| 0.8465277777777778 | 0 |
| 0.8472222222222222 | 0 |
| 0.8479166666666668 | 0 |
| 0.8486111111111111 | 0 |
| 0.8493055555555555 | 0 |
| 0.85 | 0 |
| 0.8506944444444445 | 0 |
| 0.8513888888888889 | 0 |
| 0.8520833333333333 | 0 |
| 0.8527777777777777 | 0 |
| 0.8534722222222223 | 0 |
| 0.8541666666666666 | 0 |
| 0.8548611111111111 | 0 |
| 0.8555555555555556 | 0 |
| 0.8562500000000001 | 0 |
| 0.8569444444444444 | 0 |
| 0.8576388888888888 | 0 |
| 0.8583333333333334 | 0 |
| 0.8590277777777778 | 0 |
| 0.8597222222222222 | 0 |
| 0.8604166666666666 | 0 |
| 0.8611111111111112 | 0 |
| 0.8618055555555556 | 0 |
| 0.8624999999999999 | 0 |
| 0.8631944444444444 | 0 |
| 0.8638888888888889 | 0 |
| 0.8645833333333334 | 0 |
| 0.8652777777777777 | 0 |
| 0.8659722222222223 | 0 |
| 0.8666666666666667 | 0 |
| 0.8673611111111111 | 0 |
| 0.8680555555555555 | 0 |
| 0.86875 | 0 |
| 0.8694444444444445 | 0 |
| 0.8701388888888889 | 0 |
| 0.8708333333333332 | 0 |
| 0.8715277777777778 | 0 |
| 0.8722222222222222 | 0 |
| 0.8729166666666667 | 0 |
| 0.873611111111111 | 0 |
| 0.8743055555555556 | 0 |
| 0.875 | 0 |
| 0.8756944444444444 | 0 |
| 0.876388888888889 | 0 |
| 0.8770833333333333 | 0 |
| 0.8777777777777778 | 0 |
| 0.8784722222222222 | 0 |
| 0.8791666666666668 | 0 |
| 0.8798611111111111 | 0 |
| 0.8805555555555555 | 0 |
| 0.88125 | 0 |
| 0.8819444444444445 | 0 |
| 0.8826388888888889 | 0 |
| 0.8833333333333333 | 0 |
| 0.8840277777777777 | 0 |
| 0.8847222222222223 | 0 |
| 0.8854166666666666 | 0 |
| 0.8861111111111111 | 0 |
| 0.8868055555555556 | 0 |
| 0.8875000000000001 | 0 |
| 0.8881944444444444 | 0 |
| 0.8888888888888888 | 0 |
| 0.8895833333333334 | 0 |
| 0.8902777777777778 | 0 |
| 0.8909722222222222 | 0 |
| 0.8916666666666666 | 0 |
| 0.8923611111111112 | 0 |
| 0.8930555555555556 | 0 |
| 0.8937499999999999 | 0 |
| 0.8944444444444444 | 0 |
| 0.8951388888888889 | 0 |
| 0.8958333333333334 | 0 |
| 0.8965277777777777 | 0 |
| 0.8972222222222223 | 0 |
| 0.8979166666666667 | 0 |
| 0.8986111111111111 | 0 |
| 0.8993055555555555 | 0 |
| 0.9 | 0 |
| 0.9006944444444445 | 0 |
| 0.9013888888888889 | 0 |
| 0.9020833333333332 | 0 |
| 0.9027777777777778 | 0 |
| 0.9034722222222222 | 0 |
| 0.9041666666666667 | 0 |
| 0.904861111111111 | 0 |
| 0.9055555555555556 | 0 |
| 0.90625 | 0 |
| 0.9069444444444444 | 0 |
| 0.907638888888889 | 0 |
| 0.9083333333333333 | 0 |
| 0.9090277777777778 | 0 |
| 0.9097222222222222 | 0 |
| 0.9104166666666668 | 0 |
| 0.9111111111111111 | 0 |
| 0.9118055555555555 | 0 |
| 0.9125 | 0 |
| 0.9131944444444445 | 0 |
| 0.9138888888888889 | 0 |
| 0.9145833333333333 | 0 |
| 0.9152777777777777 | 0 |
| 0.9159722222222223 | 0 |
| 0.9166666666666666 | 0 |
| 0.9173611111111111 | 0 |
| 0.9180555555555556 | 0 |
| 0.9187500000000001 | 0 |
| 0.9194444444444444 | 0 |
| 0.9201388888888888 | 0 |
| 0.9208333333333334 | 0 |
| 0.9215277777777778 | 0 |
| 0.9222222222222222 | 0 |
| 0.9229166666666666 | 0 |
| 0.9236111111111112 | 0 |
| 0.9243055555555556 | 0 |
| 0.9249999999999999 | 0 |
| 0.9256944444444444 | 0 |
| 0.9263888888888889 | 0 |
| 0.9270833333333334 | 0 |
| 0.9277777777777777 | 0 |
| 0.9284722222222223 | 0 |
| 0.9291666666666667 | 0 |
| 0.9298611111111111 | 0 |
| 0.9305555555555555 | 0 |
| 0.93125 | 0 |
| 0.9319444444444445 | 0 |
| 0.9326388888888889 | 0 |
| 0.9333333333333332 | 0 |
| 0.9340277777777778 | 0 |
| 0.9347222222222222 | 0 |
| 0.9354166666666667 | 0 |
| 0.936111111111111 | 0 |
| 0.9368055555555556 | 0 |
| 0.9375 | 0 |
| 0.9381944444444444 | 0 |
| 0.938888888888889 | 0 |
| 0.9395833333333333 | 0 |
| 0.9402777777777778 | 0 |
| 0.9409722222222222 | 0 |
| 0.9416666666666668 | 0 |
| 0.9423611111111111 | 0 |
| 0.9430555555555555 | 0 |
| 0.94375 | 0 |
| 0.9444444444444445 | 0 |
| 0.9451388888888889 | 0 |
| 0.9458333333333333 | 0 |
| 0.9465277777777777 | 0 |
| 0.9472222222222223 | 0 |
| 0.9479166666666666 | 0 |
| 0.9486111111111111 | 0 |
| 0.9493055555555556 | 0 |
| 0.9500000000000001 | 0 |
| 0.9506944444444444 | 0 |
| 0.9513888888888888 | 0 |
| 0.9520833333333334 | 0 |
| 0.9527777777777778 | 0 |
| 0.9534722222222222 | 0 |
| 0.9541666666666666 | 0 |
| 0.9548611111111112 | 0 |
| 0.9555555555555556 | 0 |
| 0.9562499999999999 | 0 |
| 0.9569444444444444 | 0 |
| 0.9576388888888889 | 0 |
| 0.9583333333333334 | 0 |
| 0.9590277777777777 | 0 |
| 0.9597222222222223 | 0 |
| 0.9604166666666667 | 0 |
| 0.9611111111111111 | 0 |
| 0.9618055555555555 | 0 |
| 0.9625 | 0 |
| 0.9631944444444445 | 0 |
| 0.9638888888888889 | 0 |
| 0.9645833333333332 | 0 |
| 0.9652777777777778 | 0 |
| 0.9659722222222222 | 0 |
| 0.9666666666666667 | 0 |
| 0.967361111111111 | 0 |
| 0.9680555555555556 | 0 |
| 0.96875 | 0 |
| 0.9694444444444444 | 0 |
| 0.970138888888889 | 0 |
| 0.9708333333333333 | 0 |
| 0.9715277777777778 | 0 |
| 0.9722222222222222 | 0 |
| 0.9729166666666668 | 0 |
| 0.9736111111111111 | 0 |
| 0.9743055555555555 | 0 |
| 0.975 | 0 |
| 0.9756944444444445 | 0 |
| 0.9763888888888889 | 0 |
| 0.9770833333333333 | 0 |
| 0.9777777777777777 | 0 |
| 0.9784722222222223 | 0 |
| 0.9791666666666666 | 0 |
| 0.9798611111111111 | 0 |
| 0.9805555555555556 | 0 |
| 0.9812500000000001 | 0 |
| 0.9819444444444444 | 0 |
| 0.9826388888888888 | 0 |
| 0.9833333333333334 | 0 |
| 0.9840277777777778 | 0 |
| 0.9847222222222222 | 0 |
| 0.9854166666666666 | 0 |
| 0.9861111111111112 | 0 |
| 0.9868055555555556 | 0 |
| 0.9874999999999999 | 0 |
| 0.9881944444444444 | 0 |
| 0.9888888888888889 | 0 |
| 0.9895833333333334 | 0 |
| 0.9902777777777777 | 0 |
| 0.9909722222222223 | 0 |
| 0.9916666666666667 | 0 |
| 0.9923611111111111 | 0 |
| 0.9930555555555555 | 0 |
| 0.99375 | 0 |
| 0.9944444444444445 | 0 |
| 0.9951388888888889 | 0 |
| 0.9958333333333332 | 0 |
| 0.9965277777777778 | 0 |
| 0.9972222222222222 | 0 |
| 0.9979166666666667 | 0 |
| 0.998611111111111 | 0 |
| 0.9993055555555556 | 0 |